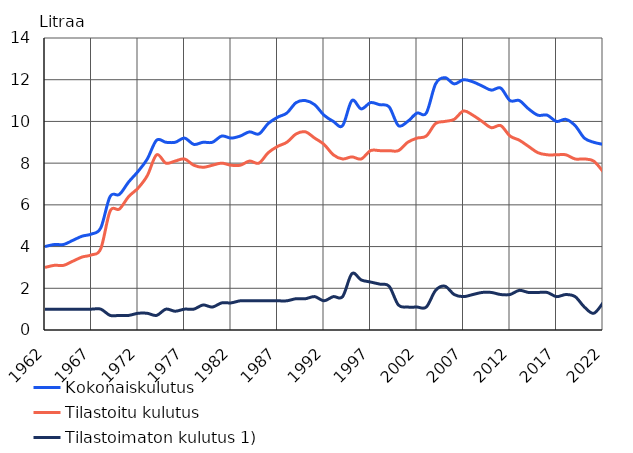
| Category | Kokonaiskulutus  | Tilastoitu kulutus  | Tilastoimaton kulutus 1) |
|---|---|---|---|
| 1962.0 | 4 | 3 | 1 |
| 1963.0 | 4.1 | 3.1 | 1 |
| 1964.0 | 4.1 | 3.1 | 1 |
| 1965.0 | 4.3 | 3.3 | 1 |
| 1966.0 | 4.5 | 3.5 | 1 |
| 1967.0 | 4.6 | 3.6 | 1 |
| 1968.0 | 4.9 | 3.9 | 1 |
| 1969.0 | 6.4 | 5.7 | 0.7 |
| 1970.0 | 6.5 | 5.8 | 0.7 |
| 1971.0 | 7.1 | 6.4 | 0.7 |
| 1972.0 | 7.6 | 6.8 | 0.8 |
| 1973.0 | 8.2 | 7.4 | 0.8 |
| 1974.0 | 9.1 | 8.4 | 0.7 |
| 1975.0 | 9 | 8 | 1 |
| 1976.0 | 9 | 8.1 | 0.9 |
| 1977.0 | 9.2 | 8.2 | 1 |
| 1978.0 | 8.9 | 7.9 | 1 |
| 1979.0 | 9 | 7.8 | 1.2 |
| 1980.0 | 9 | 7.9 | 1.1 |
| 1981.0 | 9.3 | 8 | 1.3 |
| 1982.0 | 9.2 | 7.9 | 1.3 |
| 1983.0 | 9.3 | 7.9 | 1.4 |
| 1984.0 | 9.5 | 8.1 | 1.4 |
| 1985.0 | 9.4 | 8 | 1.4 |
| 1986.0 | 9.9 | 8.5 | 1.4 |
| 1987.0 | 10.2 | 8.8 | 1.4 |
| 1988.0 | 10.4 | 9 | 1.4 |
| 1989.0 | 10.9 | 9.4 | 1.5 |
| 1990.0 | 11 | 9.5 | 1.5 |
| 1991.0 | 10.8 | 9.2 | 1.6 |
| 1992.0 | 10.3 | 8.9 | 1.4 |
| 1993.0 | 10 | 8.4 | 1.6 |
| 1994.0 | 9.8 | 8.2 | 1.6 |
| 1995.0 | 11 | 8.3 | 2.7 |
| 1996.0 | 10.6 | 8.2 | 2.4 |
| 1997.0 | 10.9 | 8.6 | 2.3 |
| 1998.0 | 10.8 | 8.6 | 2.2 |
| 1999.0 | 10.7 | 8.6 | 2.1 |
| 2000.0 | 9.8 | 8.6 | 1.2 |
| 2001.0 | 10 | 9 | 1.1 |
| 2002.0 | 10.4 | 9.2 | 1.1 |
| 2003.0 | 10.4 | 9.3 | 1.1 |
| 2004.0 | 11.8 | 9.9 | 1.9 |
| 2005.0 | 12.1 | 10 | 2.1 |
| 2006.0 | 11.8 | 10.1 | 1.7 |
| 2007.0 | 12 | 10.5 | 1.6 |
| 2008.0 | 11.9 | 10.3 | 1.7 |
| 2009.0 | 11.7 | 10 | 1.8 |
| 2010.0 | 11.5 | 9.7 | 1.8 |
| 2011.0 | 11.6 | 9.8 | 1.7 |
| 2012.0 | 11 | 9.3 | 1.7 |
| 2013.0 | 11 | 9.1 | 1.9 |
| 2014.0 | 10.6 | 8.8 | 1.8 |
| 2015.0 | 10.3 | 8.5 | 1.8 |
| 2016.0 | 10.3 | 8.4 | 1.8 |
| 2017.0 | 10 | 8.4 | 1.6 |
| 2018.0 | 10.1 | 8.4 | 1.7 |
| 2019.0 | 9.8 | 8.2 | 1.6 |
| 2020.0 | 9.2 | 8.2 | 1.1 |
| 2021.0 | 9 | 8.1 | 0.8 |
| 2022.0 | 8.9 | 7.6 | 1.3 |